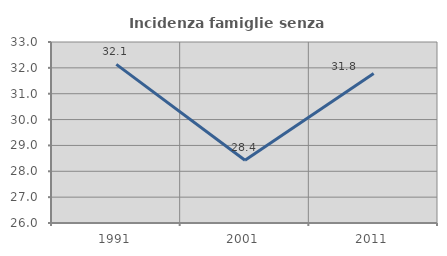
| Category | Incidenza famiglie senza nuclei |
|---|---|
| 1991.0 | 32.135 |
| 2001.0 | 28.426 |
| 2011.0 | 31.783 |